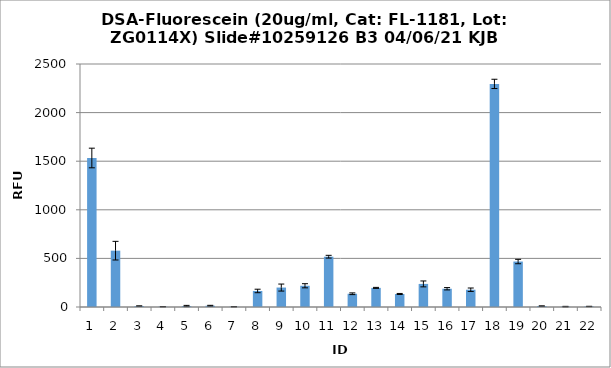
| Category | Series 0 |
|---|---|
| 0 | 1533 |
| 1 | 579.5 |
| 2 | 9.75 |
| 3 | 2.75 |
| 4 | 10 |
| 5 | 13 |
| 6 | 2.5 |
| 7 | 165 |
| 8 | 200 |
| 9 | 218.5 |
| 10 | 517.5 |
| 11 | 136.25 |
| 12 | 196.75 |
| 13 | 134 |
| 14 | 237.5 |
| 15 | 187.75 |
| 16 | 177.75 |
| 17 | 2295.25 |
| 18 | 467.75 |
| 19 | 9.5 |
| 20 | 3.75 |
| 21 | 5.5 |